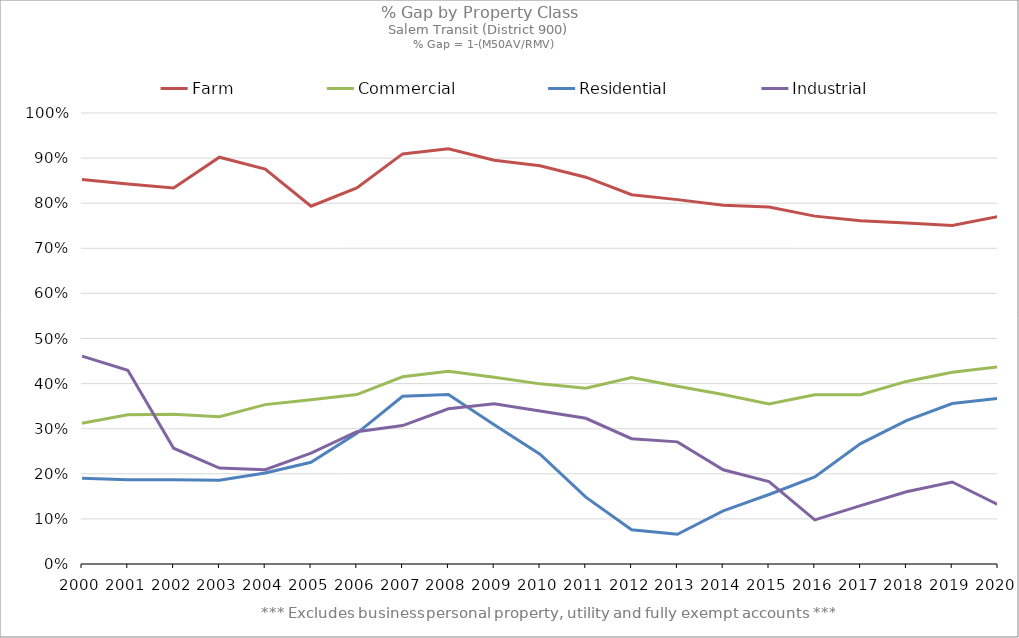
| Category | Farm | Commercial | Residential | Industrial |
|---|---|---|---|---|
| 2000.0 | 0.853 | 0.312 | 0.19 | 0.461 |
| 2001.0 | 0.843 | 0.331 | 0.187 | 0.429 |
| 2002.0 | 0.834 | 0.332 | 0.187 | 0.257 |
| 2003.0 | 0.902 | 0.326 | 0.186 | 0.213 |
| 2004.0 | 0.876 | 0.353 | 0.202 | 0.209 |
| 2005.0 | 0.793 | 0.364 | 0.225 | 0.246 |
| 2006.0 | 0.834 | 0.376 | 0.29 | 0.293 |
| 2007.0 | 0.909 | 0.415 | 0.372 | 0.307 |
| 2008.0 | 0.921 | 0.428 | 0.376 | 0.344 |
| 2009.0 | 0.895 | 0.414 | 0.308 | 0.355 |
| 2010.0 | 0.883 | 0.399 | 0.244 | 0.339 |
| 2011.0 | 0.858 | 0.39 | 0.148 | 0.323 |
| 2012.0 | 0.819 | 0.413 | 0.076 | 0.278 |
| 2013.0 | 0.808 | 0.394 | 0.066 | 0.271 |
| 2014.0 | 0.795 | 0.376 | 0.118 | 0.209 |
| 2015.0 | 0.791 | 0.355 | 0.154 | 0.183 |
| 2016.0 | 0.771 | 0.375 | 0.193 | 0.098 |
| 2017.0 | 0.761 | 0.375 | 0.267 | 0.13 |
| 2018.0 | 0.756 | 0.405 | 0.318 | 0.16 |
| 2019.0 | 0.75 | 0.425 | 0.356 | 0.182 |
| 2020.0 | 0.77 | 0.437 | 0.367 | 0.132 |